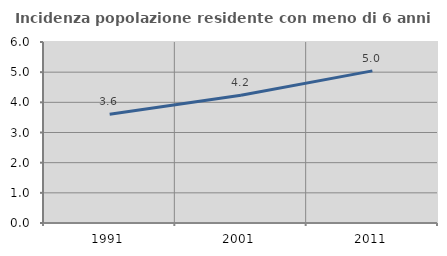
| Category | Incidenza popolazione residente con meno di 6 anni |
|---|---|
| 1991.0 | 3.603 |
| 2001.0 | 4.235 |
| 2011.0 | 5.042 |